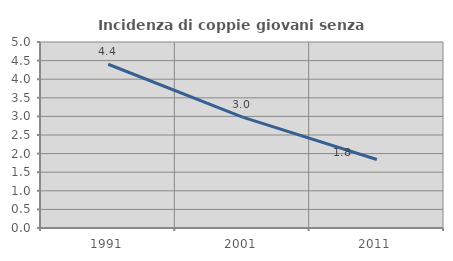
| Category | Incidenza di coppie giovani senza figli |
|---|---|
| 1991.0 | 4.402 |
| 2001.0 | 2.981 |
| 2011.0 | 1.842 |